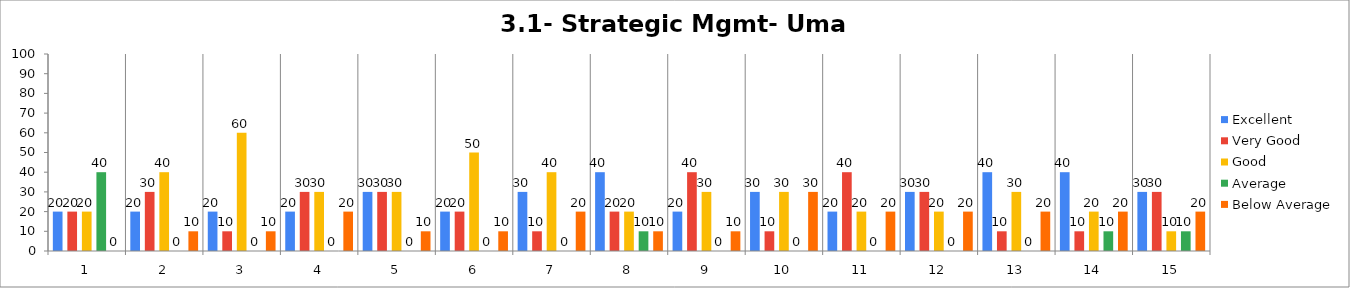
| Category | Excellent | Very Good | Good | Average | Below Average |
|---|---|---|---|---|---|
| 0 | 20 | 20 | 20 | 40 | 0 |
| 1 | 20 | 30 | 40 | 0 | 10 |
| 2 | 20 | 10 | 60 | 0 | 10 |
| 3 | 20 | 30 | 30 | 0 | 20 |
| 4 | 30 | 30 | 30 | 0 | 10 |
| 5 | 20 | 20 | 50 | 0 | 10 |
| 6 | 30 | 10 | 40 | 0 | 20 |
| 7 | 40 | 20 | 20 | 10 | 10 |
| 8 | 20 | 40 | 30 | 0 | 10 |
| 9 | 30 | 10 | 30 | 0 | 30 |
| 10 | 20 | 40 | 20 | 0 | 20 |
| 11 | 30 | 30 | 20 | 0 | 20 |
| 12 | 40 | 10 | 30 | 0 | 20 |
| 13 | 40 | 10 | 20 | 10 | 20 |
| 14 | 30 | 30 | 10 | 10 | 20 |